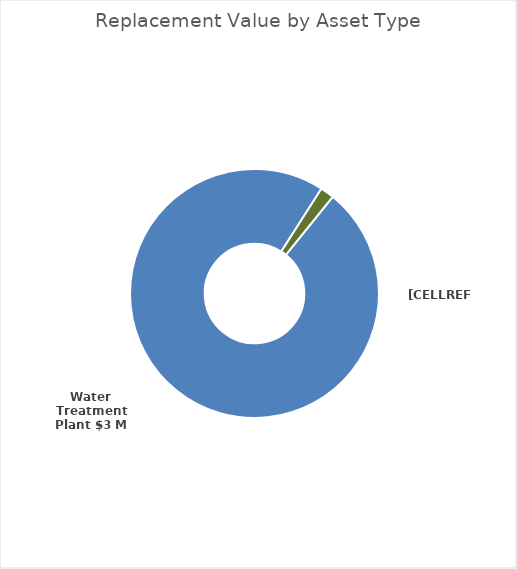
| Category | Series 1 |
|---|---|
| Water Treatment Plant | 2970000 |
| Pump Station and Reservoir  | 0 |
| Water Riser Tower (reservoir) | 0 |
| Pumphouses | 0 |
| Water Mains | 54000 |
| Portable Water Pipe | 0 |
| Hydrants | 0 |
| Valves | 0 |
| Service Connection | 0 |
| Service Connection Valve | 0 |
| Water Trucks | 0 |